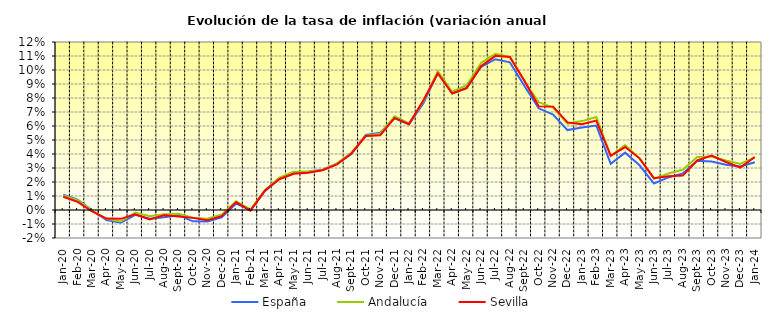
| Category | España | Andalucía | Sevilla |
|---|---|---|---|
| 2020-01-01 | 0.011 | 0.01 | 0.009 |
| 2020-02-01 | 0.007 | 0.007 | 0.006 |
| 2020-03-01 | 0 | 0 | -0.001 |
| 2020-04-01 | -0.007 | -0.006 | -0.006 |
| 2020-05-01 | -0.009 | -0.008 | -0.006 |
| 2020-06-01 | -0.003 | -0.002 | -0.003 |
| 2020-07-01 | -0.006 | -0.004 | -0.007 |
| 2020-08-01 | -0.005 | -0.003 | -0.004 |
| 2020-09-01 | -0.004 | -0.003 | -0.005 |
| 2020-10-01 | -0.008 | -0.005 | -0.006 |
| 2020-11-01 | -0.008 | -0.006 | -0.007 |
| 2020-12-01 | -0.005 | -0.003 | -0.004 |
| 2021-01-01 | 0.005 | 0.006 | 0.006 |
| 2021-02-01 | 0 | 0 | 0 |
| 2021-03-01 | 0.013 | 0.014 | 0.014 |
| 2021-04-01 | 0.022 | 0.023 | 0.022 |
| 2021-05-01 | 0.027 | 0.027 | 0.026 |
| 2021-06-01 | 0.027 | 0.027 | 0.027 |
| 2021-07-01 | 0.029 | 0.029 | 0.028 |
| 2021-08-01 | 0.033 | 0.033 | 0.033 |
| 2021-09-01 | 0.04 | 0.041 | 0.04 |
| 2021-10-01 | 0.054 | 0.053 | 0.053 |
| 2021-11-01 | 0.055 | 0.054 | 0.053 |
| 2021-12-01 | 0.065 | 0.067 | 0.066 |
| 2022-01-01 | 0.061 | 0.062 | 0.061 |
| 2022-02-01 | 0.076 | 0.078 | 0.078 |
| 2022-03-01 | 0.098 | 0.099 | 0.098 |
| 2022-04-01 | 0.083 | 0.084 | 0.083 |
| 2022-05-01 | 0.087 | 0.089 | 0.087 |
| 2022-06-01 | 0.102 | 0.105 | 0.103 |
| 2022-07-01 | 0.108 | 0.112 | 0.11 |
| 2022-08-01 | 0.105 | 0.109 | 0.109 |
| 2022-09-01 | 0.089 | 0.092 | 0.092 |
| 2022-10-01 | 0.073 | 0.077 | 0.074 |
| 2022-11-01 | 0.068 | 0.073 | 0.074 |
| 2022-12-01 | 0.057 | 0.062 | 0.063 |
| 2023-01-01 | 0.059 | 0.063 | 0.061 |
| 2023-02-01 | 0.06 | 0.066 | 0.064 |
| 2023-03-01 | 0.033 | 0.039 | 0.039 |
| 2023-04-01 | 0.041 | 0.046 | 0.045 |
| 2023-05-01 | 0.032 | 0.037 | 0.037 |
| 2023-06-01 | 0.019 | 0.022 | 0.023 |
| 2023-07-01 | 0.023 | 0.026 | 0.024 |
| 2023-08-01 | 0.026 | 0.029 | 0.025 |
| 2023-09-01 | 0.035 | 0.038 | 0.035 |
| 2023-10-01 | 0.035 | 0.038 | 0.039 |
| 2023-11-01 | 0.032 | 0.035 | 0.034 |
| 2023-12-01 | 0.031 | 0.033 | 0.03 |
| 2024-01-01 | 0.034 | 0.038 | 0.038 |